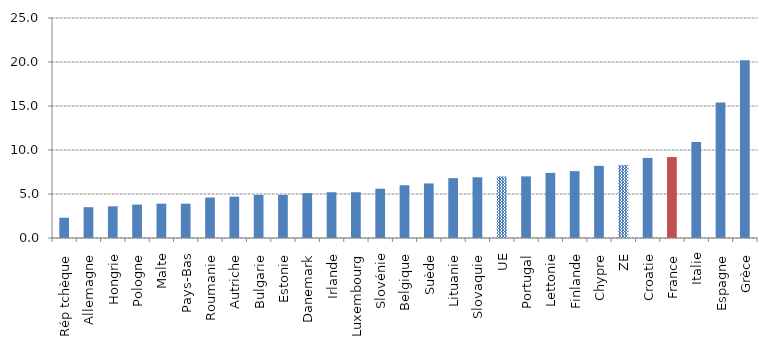
| Category | 2018Q2 |
|---|---|
| Rép tchèque | 2.3 |
| Allemagne | 3.5 |
| Hongrie | 3.6 |
| Pologne | 3.8 |
| Malte | 3.9 |
| Pays-Bas | 3.9 |
| Roumanie | 4.6 |
| Autriche | 4.7 |
| Bulgarie | 4.9 |
| Estonie | 4.9 |
| Danemark | 5.1 |
| Irlande | 5.2 |
| Luxembourg | 5.2 |
| Slovénie | 5.6 |
| Belgique | 6 |
| Suède | 6.2 |
| Lituanie | 6.8 |
| Slovaquie | 6.9 |
| UE | 7 |
| Portugal | 7 |
| Lettonie | 7.4 |
| Finlande | 7.6 |
| Chypre | 8.2 |
| ZE | 8.3 |
| Croatie | 9.1 |
| France | 9.2 |
| Italie | 10.9 |
| Espagne | 15.4 |
| Grèce | 20.2 |